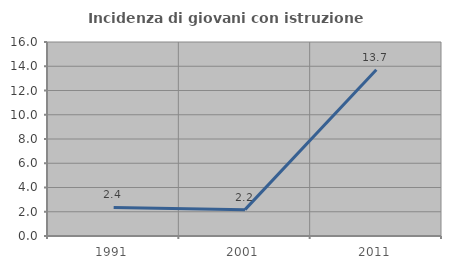
| Category | Incidenza di giovani con istruzione universitaria |
|---|---|
| 1991.0 | 2.353 |
| 2001.0 | 2.174 |
| 2011.0 | 13.71 |